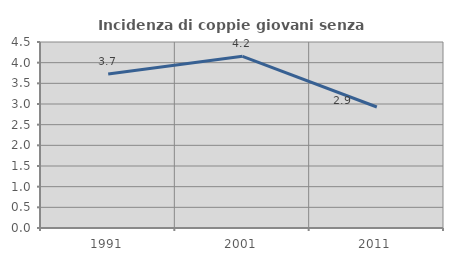
| Category | Incidenza di coppie giovani senza figli |
|---|---|
| 1991.0 | 3.728 |
| 2001.0 | 4.153 |
| 2011.0 | 2.927 |